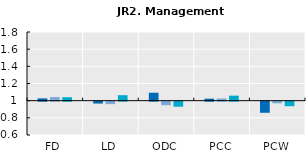
| Category | 2005 | 2010 | 2015 |
|---|---|---|---|
| FD | 1.027 | 1.042 | 1.04 |
| LD | 0.978 | 0.971 | 1.064 |
| ODC | 1.093 | 0.959 | 0.941 |
| PCC | 1.024 | 1.025 | 1.058 |
| PCW | 0.871 | 0.981 | 0.947 |